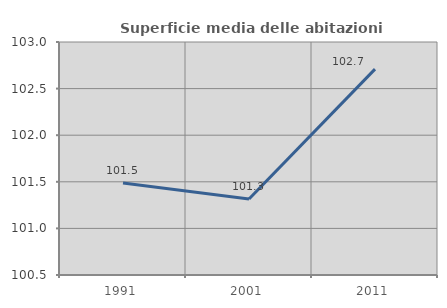
| Category | Superficie media delle abitazioni occupate |
|---|---|
| 1991.0 | 101.486 |
| 2001.0 | 101.315 |
| 2011.0 | 102.709 |